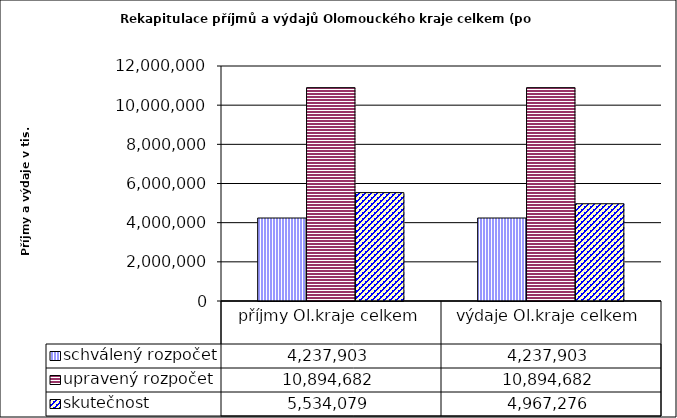
| Category | schválený rozpočet | upravený rozpočet | skutečnost |
|---|---|---|---|
| příjmy Ol.kraje celkem | 4237903 | 10894682 | 5534079 |
| výdaje Ol.kraje celkem | 4237903 | 10894682 | 4967276 |